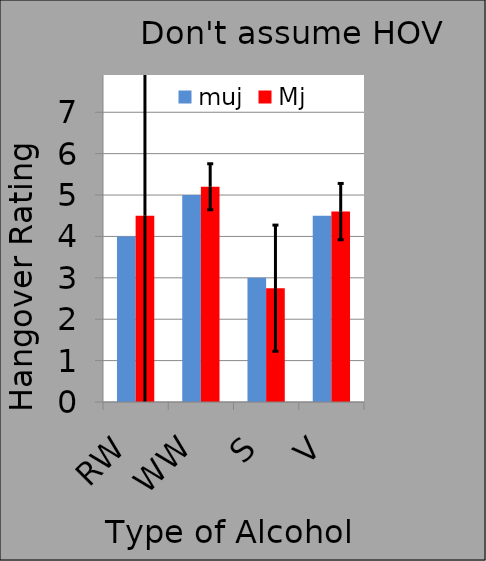
| Category | muj | Mj |
|---|---|---|
| RW | 4 | 4.5 |
| WW | 5 | 5.2 |
| S | 3 | 2.75 |
| V | 4.5 | 4.6 |